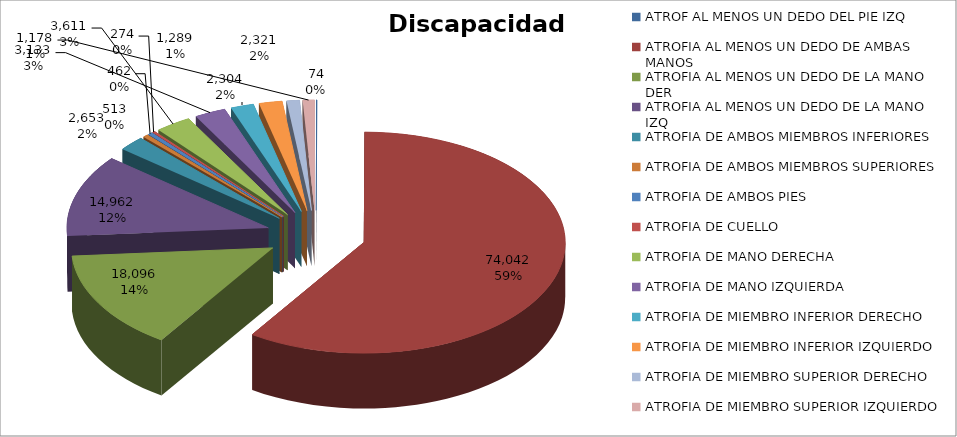
| Category | Series 0 | Series 1 | Series 2 |
|---|---|---|---|
| ATROF AL MENOS UN DEDO DEL PIE IZQ | 74 | 2 | 76 |
| ATROFIA AL MENOS UN DEDO DE AMBAS MANOS | 74042 | 652 | 74694 |
| ATROFIA AL MENOS UN DEDO DE LA MANO DER | 18096 | 352 | 18448 |
| ATROFIA AL MENOS UN DEDO DE LA MANO IZQ | 14962 | 304 | 15266 |
| ATROFIA DE AMBOS MIEMBROS INFERIORES | 2653 | 26 | 2679 |
| ATROFIA DE AMBOS MIEMBROS SUPERIORES | 513 | 9 | 522 |
| ATROFIA DE AMBOS PIES | 462 | 7 | 469 |
| ATROFIA DE CUELLO | 274 | 0 | 274 |
| ATROFIA DE MANO DERECHA | 3611 | 47 | 3658 |
| ATROFIA DE MANO IZQUIERDA | 3133 | 44 | 3177 |
| ATROFIA DE MIEMBRO INFERIOR DERECHO | 2304 | 25 | 2329 |
| ATROFIA DE MIEMBRO INFERIOR IZQUIERDO | 2321 | 18 | 2339 |
| ATROFIA DE MIEMBRO SUPERIOR DERECHO | 1289 | 18 | 1307 |
| ATROFIA DE MIEMBRO SUPERIOR IZQUIERDO | 1178 | 16 | 1194 |